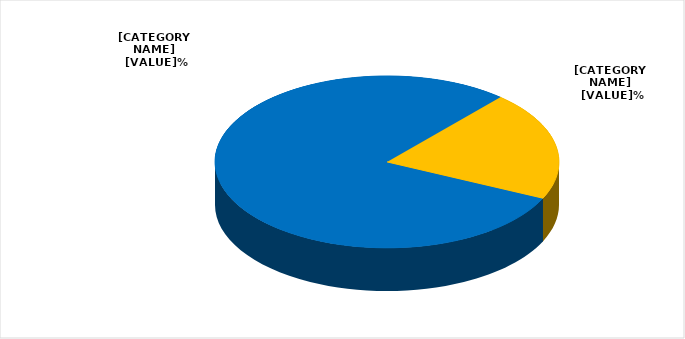
| Category | Series 0 |
|---|---|
| birinci növbədə    | 79.5 |
| ikinci və ya üçüncü növbələrdə  | 20.5 |